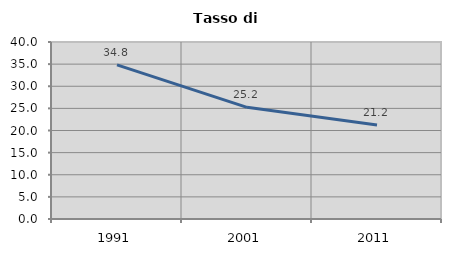
| Category | Tasso di disoccupazione   |
|---|---|
| 1991.0 | 34.844 |
| 2001.0 | 25.23 |
| 2011.0 | 21.24 |